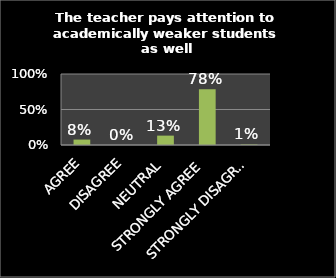
| Category | Series 0 |
|---|---|
| AGREE | 0.076 |
| DISAGREE | 0 |
| NEUTRAL | 0.132 |
| STRONGLY AGREE | 0.784 |
| STRONGLY DISAGREE | 0.008 |